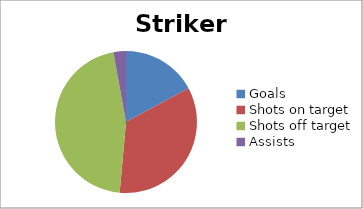
| Category | Striker2 |
|---|---|
| Goals | 12 |
| Shots on target | 24 |
| Shots off target | 32 |
| Assists | 2 |